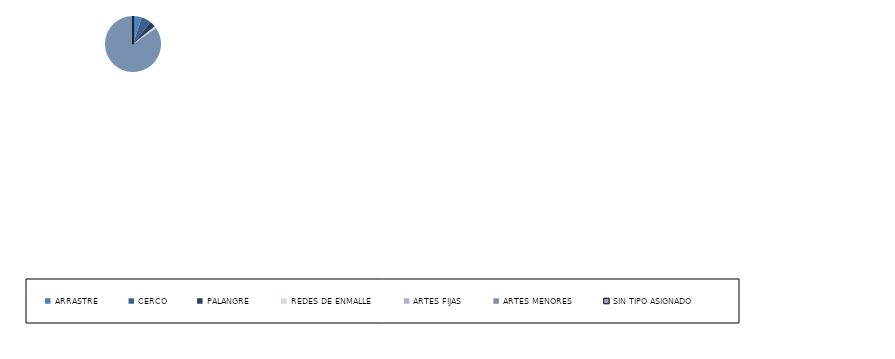
| Category | Series 0 |
|---|---|
| ARRASTRE | 16 |
| CERCO | 18 |
| PALANGRE | 11 |
| REDES DE ENMALLE | 3 |
| ARTES FIJAS | 1 |
| ARTES MENORES | 268 |
| SIN TIPO ASIGNADO | 0 |